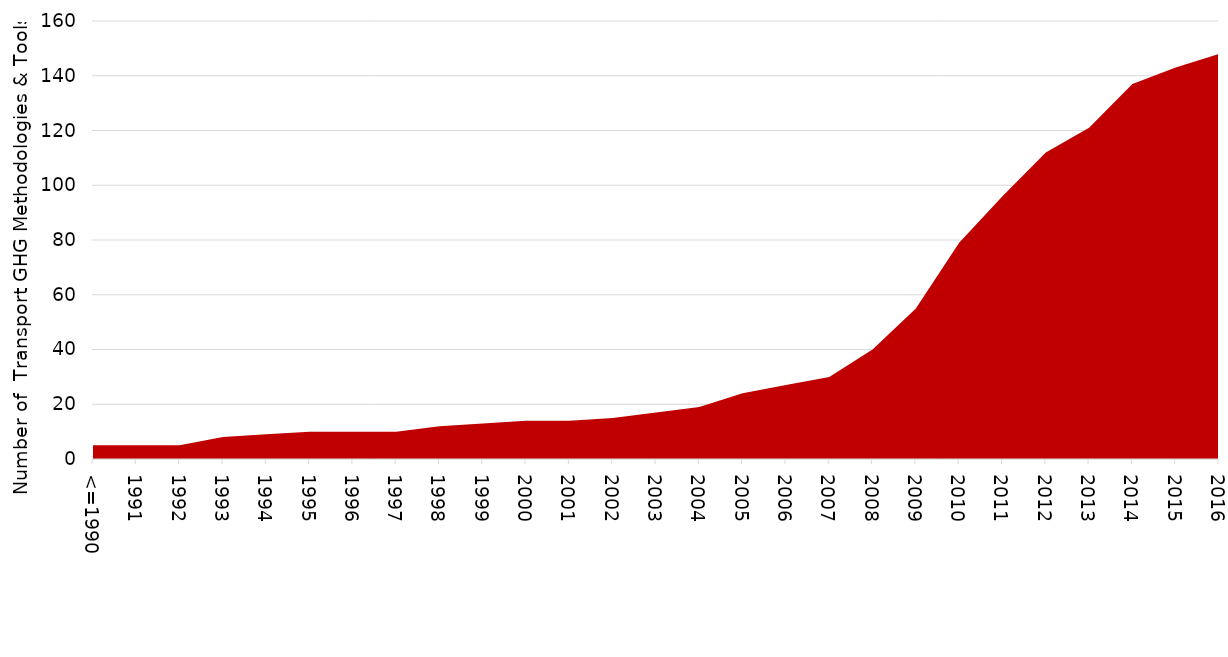
| Category | Series 0 |
|---|---|
| <=1990 | 5 |
| 1991 | 5 |
| 1992 | 5 |
| 1993 | 8 |
| 1994 | 9 |
| 1995 | 10 |
| 1996 | 10 |
| 1997 | 10 |
| 1998 | 12 |
| 1999 | 13 |
| 2000 | 14 |
| 2001 | 14 |
| 2002 | 15 |
| 2003 | 17 |
| 2004 | 19 |
| 2005 | 24 |
| 2006 | 27 |
| 2007 | 30 |
| 2008 | 40 |
| 2009 | 55 |
| 2010 | 79 |
| 2011 | 96 |
| 2012 | 112 |
| 2013 | 121 |
| 2014 | 137 |
| 2015 | 143 |
| 2016 | 148 |